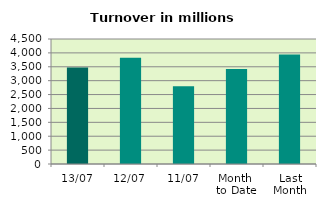
| Category | Series 0 |
|---|---|
| 13/07 | 3476.082 |
| 12/07 | 3821.719 |
| 11/07 | 2795.842 |
| Month 
to Date | 3418.402 |
| Last
Month | 3940.311 |